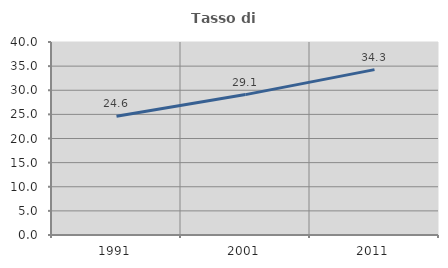
| Category | Tasso di occupazione   |
|---|---|
| 1991.0 | 24.597 |
| 2001.0 | 29.098 |
| 2011.0 | 34.274 |